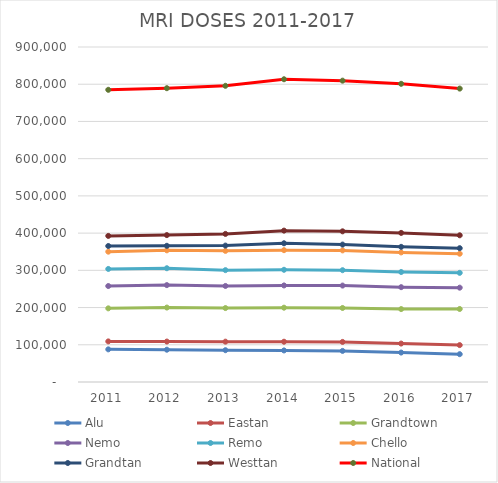
| Category | Alu | Eastan | Grandtown | Nemo | Remo | Chello | Grandtan | Westtan | National |
|---|---|---|---|---|---|---|---|---|---|
| 2011.0 | 87725 | 21351 | 88802 | 59926 | 45928 | 46390 | 15213 | 27163 | 392498 |
| 2012.0 | 86763 | 21900 | 91338 | 60291 | 45352 | 48133 | 12122 | 28764 | 394663 |
| 2013.0 | 85432 | 22942 | 90270 | 59371 | 42523 | 51740 | 14201 | 31397 | 397876 |
| 2014.0 | 84787 | 23419 | 91448 | 59748 | 42064 | 52699 | 18503 | 33998 | 406666 |
| 2015.0 | 83532 | 24104 | 91218 | 60221 | 41310 | 53196 | 15635 | 35572 | 404788 |
| 2016.0 | 79062 | 24192 | 92655 | 58870 | 40730 | 52609 | 14978 | 37461 | 400557 |
| 2017.0 | 74746 | 24387 | 97075 | 57228 | 39808 | 51387 | 14866 | 34636 | 394133 |